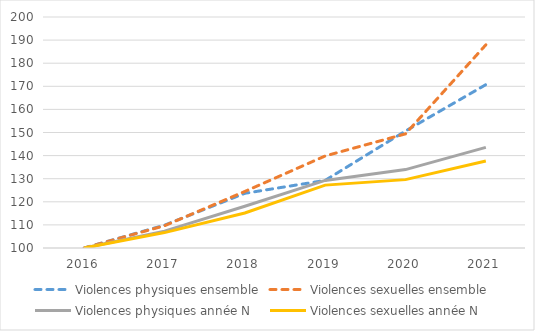
| Category | Violences physiques ensemble | Violences sexuelles ensemble | Violences physiques année N | Violences sexuelles année N |
|---|---|---|---|---|
| 2016.0 | 100 | 100 | 100 | 100 |
| 2017.0 | 109.869 | 109.636 | 107.292 | 106.674 |
| 2018.0 | 123.678 | 124.475 | 118.054 | 115.158 |
| 2019.0 | 129.265 | 139.842 | 129.265 | 127.225 |
| 2020.0 | 150.643 | 149.409 | 133.939 | 129.6 |
| 2021.0 | 170.712 | 187.941 | 143.551 | 137.67 |